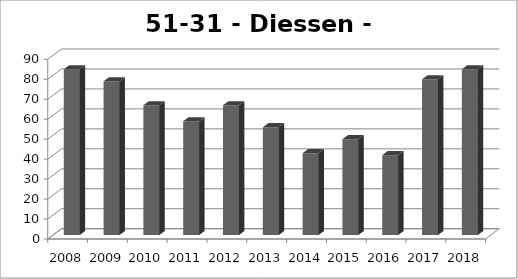
| Category | Diessen - Baarschot |
|---|---|
| 2008.0 | 83 |
| 2009.0 | 77 |
| 2010.0 | 65 |
| 2011.0 | 57 |
| 2012.0 | 65 |
| 2013.0 | 54 |
| 2014.0 | 41 |
| 2015.0 | 48 |
| 2016.0 | 40 |
| 2017.0 | 78 |
| 2018.0 | 83 |